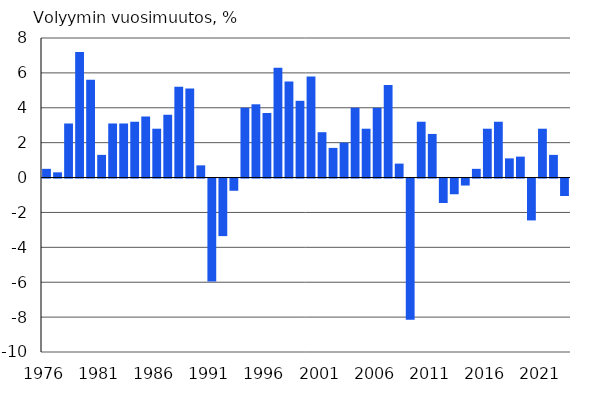
| Category | Volyymin vuosimuutos, % |
|---|---|
| 1976 | 0.5 |
| 1977 | 0.3 |
| 1978 | 3.1 |
| 1979 | 7.2 |
| 1980 | 5.6 |
| 1981 | 1.3 |
| 1982 | 3.1 |
| 1983 | 3.1 |
| 1984 | 3.2 |
| 1985 | 3.5 |
| 1986 | 2.8 |
| 1987 | 3.6 |
| 1988 | 5.2 |
| 1989 | 5.1 |
| 1990 | 0.7 |
| 1991 | -5.9 |
| 1992 | -3.3 |
| 1993 | -0.7 |
| 1994 | 4 |
| 1995 | 4.2 |
| 1996 | 3.7 |
| 1997 | 6.3 |
| 1998 | 5.5 |
| 1999 | 4.4 |
| 2000 | 5.8 |
| 2001 | 2.6 |
| 2002 | 1.7 |
| 2003 | 2 |
| 2004 | 4 |
| 2005 | 2.8 |
| 2006 | 4 |
| 2007 | 5.3 |
| 2008 | 0.8 |
| 2009 | -8.1 |
| 2010 | 3.2 |
| 2011 | 2.5 |
| 2012 | -1.4 |
| 2013 | -0.9 |
| 2014 | -0.4 |
| 2015 | 0.5 |
| 2016 | 2.8 |
| 2017 | 3.2 |
| 2018 | 1.1 |
| 2019 | 1.2 |
| 2020 | -2.4 |
| 2021 | 2.8 |
| 2022* | 1.3 |
| 2023* | -1 |